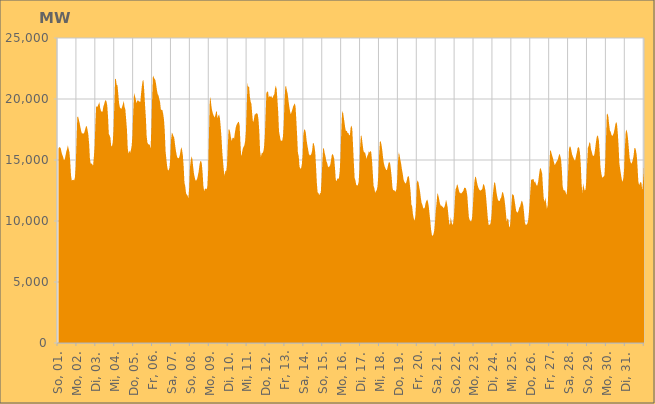
| Category | Series 0 |
|---|---|
|  So, 01.  | 15927.079 |
|  So, 01.  | 16045.231 |
|  So, 01.  | 16044.692 |
|  So, 01.  | 15960.299 |
|  So, 01.  | 15633.229 |
|  So, 01.  | 15411.511 |
|  So, 01.  | 15255.635 |
|  So, 01.  | 14985.755 |
|  So, 01.  | 15044.185 |
|  So, 01.  | 15341.107 |
|  So, 01.  | 15684.877 |
|  So, 01.  | 15892.365 |
|  So, 01.  | 16195.429 |
|  So, 01.  | 15925.532 |
|  So, 01.  | 15640.714 |
|  So, 01.  | 14873.63 |
|  So, 01.  | 13736.748 |
|  Mo, 02.  | 13320.268 |
|  Mo, 02.  | 13361.444 |
|  Mo, 02.  | 13382.235 |
|  Mo, 02.  | 13328.384 |
|  Mo, 02.  | 13590.178 |
|  Mo, 02.  | 14525.185 |
|  Mo, 02.  | 16493.735 |
|  Mo, 02.  | 18518.596 |
|  Mo, 02.  | 18562.772 |
|  Mo, 02.  | 18288.833 |
|  Mo, 02.  | 18009.511 |
|  Mo, 02.  | 17660.415 |
|  Mo, 02.  | 17361.386 |
|  Mo, 02.  | 17139.811 |
|  Mo, 02.  | 17215.992 |
|  Mo, 02.  | 17144.628 |
|  Mo, 02.  | 17276.929 |
|  Mo, 02.  | 17525.181 |
|  Mo, 02.  | 17746.54 |
|  Mo, 02.  | 17790.012 |
|  Mo, 02.  | 17465.107 |
|  Mo, 02.  | 17090.786 |
|  Mo, 02.  | 16329.262 |
|  Mo, 02.  | 15103.662 |
|  Di, 03.  | 14705.078 |
|  Di, 03.  | 14710.866 |
|  Di, 03.  | 14654.954 |
|  Di, 03.  | 14518.518 |
|  Di, 03.  | 15237.282 |
|  Di, 03.  | 16148.23 |
|  Di, 03.  | 18072.305 |
|  Di, 03.  | 19464.539 |
|  Di, 03.  | 19328.822 |
|  Di, 03.  | 19430.29 |
|  Di, 03.  | 19588.605 |
|  Di, 03.  | 19746.651 |
|  Di, 03.  | 19272.316 |
|  Di, 03.  | 19041.483 |
|  Di, 03.  | 18945.129 |
|  Di, 03.  | 18947.379 |
|  Di, 03.  | 19375.949 |
|  Di, 03.  | 19559.212 |
|  Di, 03.  | 19800.662 |
|  Di, 03.  | 19921.464 |
|  Di, 03.  | 19806.998 |
|  Di, 03.  | 19481.165 |
|  Di, 03.  | 18546.411 |
|  Di, 03.  | 17138.491 |
|  Mi, 04.  | 17009.306 |
|  Mi, 04.  | 16825.224 |
|  Mi, 04.  | 16152.452 |
|  Mi, 04.  | 16115.356 |
|  Mi, 04.  | 16464.684 |
|  Mi, 04.  | 17499.272 |
|  Mi, 04.  | 19564.759 |
|  Mi, 04.  | 21662.006 |
|  Mi, 04.  | 21613.36 |
|  Mi, 04.  | 21148.048 |
|  Mi, 04.  | 21130.086 |
|  Mi, 04.  | 20429.32 |
|  Mi, 04.  | 19655.613 |
|  Mi, 04.  | 19316.813 |
|  Mi, 04.  | 19236.579 |
|  Mi, 04.  | 19191.461 |
|  Mi, 04.  | 19379.904 |
|  Mi, 04.  | 19611.864 |
|  Mi, 04.  | 19843.908 |
|  Mi, 04.  | 19350.344 |
|  Mi, 04.  | 19131.708 |
|  Mi, 04.  | 18327.821 |
|  Mi, 04.  | 17504.851 |
|  Mi, 04.  | 15955.735 |
|  Do, 05.  | 15503.848 |
|  Do, 05.  | 15782.482 |
|  Do, 05.  | 15594.392 |
|  Do, 05.  | 15811.9 |
|  Do, 05.  | 16159.142 |
|  Do, 05.  | 17038.131 |
|  Do, 05.  | 18957.955 |
|  Do, 05.  | 20500.95 |
|  Do, 05.  | 20279.702 |
|  Do, 05.  | 20040.693 |
|  Do, 05.  | 19672.086 |
|  Do, 05.  | 19828.694 |
|  Do, 05.  | 19908.26 |
|  Do, 05.  | 19811.851 |
|  Do, 05.  | 19789.364 |
|  Do, 05.  | 19765.614 |
|  Do, 05.  | 20496.89 |
|  Do, 05.  | 21090.006 |
|  Do, 05.  | 21524.597 |
|  Do, 05.  | 21528.552 |
|  Do, 05.  | 20649.972 |
|  Do, 05.  | 19484.883 |
|  Do, 05.  | 18500.813 |
|  Do, 05.  | 16977.879 |
|  Fr, 06.  | 16422.818 |
|  Fr, 06.  | 16301.755 |
|  Fr, 06.  | 16264.225 |
|  Fr, 06.  | 16255.957 |
|  Fr, 06.  | 15922.819 |
|  Fr, 06.  | 17589.227 |
|  Fr, 06.  | 20067.82 |
|  Fr, 06.  | 21935.267 |
|  Fr, 06.  | 21796.289 |
|  Fr, 06.  | 21649.845 |
|  Fr, 06.  | 21564.097 |
|  Fr, 06.  | 21211.149 |
|  Fr, 06.  | 20744.559 |
|  Fr, 06.  | 20402.213 |
|  Fr, 06.  | 20303.792 |
|  Fr, 06.  | 20003.82 |
|  Fr, 06.  | 19773.152 |
|  Fr, 06.  | 19174.81 |
|  Fr, 06.  | 19093.821 |
|  Fr, 06.  | 19089.906 |
|  Fr, 06.  | 18779.025 |
|  Fr, 06.  | 18329.415 |
|  Fr, 06.  | 17394.875 |
|  Fr, 06.  | 15750.207 |
|  Sa, 07.  | 15083.527 |
|  Sa, 07.  | 14500.605 |
|  Sa, 07.  | 14156.062 |
|  Sa, 07.  | 14163.633 |
|  Sa, 07.  | 14374.859 |
|  Sa, 07.  | 15182.906 |
|  Sa, 07.  | 16668.899 |
|  Sa, 07.  | 17231.1 |
|  Sa, 07.  | 17156.516 |
|  Sa, 07.  | 16959.769 |
|  Sa, 07.  | 16824.289 |
|  Sa, 07.  | 16295.746 |
|  Sa, 07.  | 15822.733 |
|  Sa, 07.  | 15452.035 |
|  Sa, 07.  | 15198.79 |
|  Sa, 07.  | 15139.945 |
|  Sa, 07.  | 15162.875 |
|  Sa, 07.  | 15366.094 |
|  Sa, 07.  | 15754.077 |
|  Sa, 07.  | 16065.162 |
|  Sa, 07.  | 15806.772 |
|  Sa, 07.  | 15356.386 |
|  Sa, 07.  | 14466.235 |
|  Sa, 07.  | 13125.078 |
|  So, 08.  | 12874.201 |
|  So, 08.  | 12274.222 |
|  So, 08.  | 12161.416 |
|  So, 08.  | 12066.334 |
|  So, 08.  | 11878.799 |
|  So, 08.  | 12745.21 |
|  So, 08.  | 14416.777 |
|  So, 08.  | 14947.523 |
|  So, 08.  | 15297.003 |
|  So, 08.  | 15099.836 |
|  So, 08.  | 14476.612 |
|  So, 08.  | 13907.553 |
|  So, 08.  | 13586.481 |
|  So, 08.  | 13330.982 |
|  So, 08.  | 13319.822 |
|  So, 08.  | 13441.007 |
|  So, 08.  | 13713.567 |
|  So, 08.  | 14045.736 |
|  So, 08.  | 14562.791 |
|  So, 08.  | 14884.782 |
|  So, 08.  | 14927.401 |
|  So, 08.  | 14712.946 |
|  So, 08.  | 13975.582 |
|  So, 08.  | 12893.07 |
|  Mo, 09.  | 12432.326 |
|  Mo, 09.  | 12643.992 |
|  Mo, 09.  | 12655.448 |
|  Mo, 09.  | 12596.035 |
|  Mo, 09.  | 12788.009 |
|  Mo, 09.  | 13998.253 |
|  Mo, 09.  | 16774.513 |
|  Mo, 09.  | 19798.482 |
|  Mo, 09.  | 20189.862 |
|  Mo, 09.  | 19523.563 |
|  Mo, 09.  | 19078.41 |
|  Mo, 09.  | 18818.896 |
|  Mo, 09.  | 18655.475 |
|  Mo, 09.  | 18485.923 |
|  Mo, 09.  | 18617.385 |
|  Mo, 09.  | 18898.708 |
|  Mo, 09.  | 19039.889 |
|  Mo, 09.  | 18419.894 |
|  Mo, 09.  | 18639.972 |
|  Mo, 09.  | 18719.612 |
|  Mo, 09.  | 18433.921 |
|  Mo, 09.  | 17714.583 |
|  Mo, 09.  | 16845.671 |
|  Mo, 09.  | 15678.482 |
|  Di, 10.  | 14854.463 |
|  Di, 10.  | 14126.716 |
|  Di, 10.  | 13716.311 |
|  Di, 10.  | 14128.229 |
|  Di, 10.  | 14078.07 |
|  Di, 10.  | 14574.613 |
|  Di, 10.  | 16121.51 |
|  Di, 10.  | 17510.105 |
|  Di, 10.  | 17506.627 |
|  Di, 10.  | 17268.37 |
|  Di, 10.  | 16836.304 |
|  Di, 10.  | 16562.702 |
|  Di, 10.  | 16802.192 |
|  Di, 10.  | 16834.482 |
|  Di, 10.  | 16753.481 |
|  Di, 10.  | 17247.6 |
|  Di, 10.  | 17635.096 |
|  Di, 10.  | 17872.885 |
|  Di, 10.  | 17982.721 |
|  Di, 10.  | 18105.398 |
|  Di, 10.  | 18139.429 |
|  Di, 10.  | 17853.802 |
|  Di, 10.  | 16448.515 |
|  Di, 10.  | 15292.809 |
|  Mi, 11.  | 15578.023 |
|  Mi, 11.  | 15933.237 |
|  Mi, 11.  | 16070.48 |
|  Mi, 11.  | 16202.308 |
|  Mi, 11.  | 16530.771 |
|  Mi, 11.  | 17359.334 |
|  Mi, 11.  | 19274.159 |
|  Mi, 11.  | 21363.168 |
|  Mi, 11.  | 20988.623 |
|  Mi, 11.  | 21011.95 |
|  Mi, 11.  | 20202.534 |
|  Mi, 11.  | 19781.148 |
|  Mi, 11.  | 19590.381 |
|  Mi, 11.  | 18757.637 |
|  Mi, 11.  | 18075.677 |
|  Mi, 11.  | 18273.199 |
|  Mi, 11.  | 18709.298 |
|  Mi, 11.  | 18740.454 |
|  Mi, 11.  | 18835.824 |
|  Mi, 11.  | 18817.457 |
|  Mi, 11.  | 18756.23 |
|  Mi, 11.  | 18282.949 |
|  Mi, 11.  | 17309.56 |
|  Mi, 11.  | 15702.284 |
|  Do, 12.  | 15254.237 |
|  Do, 12.  | 15548.951 |
|  Do, 12.  | 15572.027 |
|  Do, 12.  | 15670.345 |
|  Do, 12.  | 16036.696 |
|  Do, 12.  | 16956.189 |
|  Do, 12.  | 18692.157 |
|  Do, 12.  | 20508.153 |
|  Do, 12.  | 20580.723 |
|  Do, 12.  | 20647.324 |
|  Do, 12.  | 20092.184 |
|  Do, 12.  | 20268.342 |
|  Do, 12.  | 20166.165 |
|  Do, 12.  | 20273.484 |
|  Do, 12.  | 20111.078 |
|  Do, 12.  | 20090.433 |
|  Do, 12.  | 20303.885 |
|  Do, 12.  | 20373.339 |
|  Do, 12.  | 20883.599 |
|  Do, 12.  | 21100.683 |
|  Do, 12.  | 20811.795 |
|  Do, 12.  | 19936.78 |
|  Do, 12.  | 18910.438 |
|  Do, 12.  | 17338.736 |
|  Fr, 13.  | 17002.839 |
|  Fr, 13.  | 16618.084 |
|  Fr, 13.  | 16576.585 |
|  Fr, 13.  | 16572.6 |
|  Fr, 13.  | 16915.72 |
|  Fr, 13.  | 17906.504 |
|  Fr, 13.  | 19888.688 |
|  Fr, 13.  | 21011.743 |
|  Fr, 13.  | 21049.659 |
|  Fr, 13.  | 20700.345 |
|  Fr, 13.  | 20431.747 |
|  Fr, 13.  | 19884.737 |
|  Fr, 13.  | 19387.684 |
|  Fr, 13.  | 18987.471 |
|  Fr, 13.  | 18747.448 |
|  Fr, 13.  | 18944.583 |
|  Fr, 13.  | 19160.311 |
|  Fr, 13.  | 19405.579 |
|  Fr, 13.  | 19531.265 |
|  Fr, 13.  | 19650.975 |
|  Fr, 13.  | 19377.835 |
|  Fr, 13.  | 18245.232 |
|  Fr, 13.  | 17009.302 |
|  Fr, 13.  | 15572.942 |
|  Sa, 14.  | 15327.669 |
|  Sa, 14.  | 14449.413 |
|  Sa, 14.  | 14299.104 |
|  Sa, 14.  | 14313.208 |
|  Sa, 14.  | 14658.816 |
|  Sa, 14.  | 15430.369 |
|  Sa, 14.  | 17153.365 |
|  Sa, 14.  | 17495.157 |
|  Sa, 14.  | 17493.55 |
|  Sa, 14.  | 17232.696 |
|  Sa, 14.  | 16625.506 |
|  Sa, 14.  | 16210.49 |
|  Sa, 14.  | 15839.962 |
|  Sa, 14.  | 15486.665 |
|  Sa, 14.  | 15381.416 |
|  Sa, 14.  | 15396.918 |
|  Sa, 14.  | 15482.015 |
|  Sa, 14.  | 15765.803 |
|  Sa, 14.  | 16359.188 |
|  Sa, 14.  | 16391.394 |
|  Sa, 14.  | 16123.49 |
|  Sa, 14.  | 15621.714 |
|  Sa, 14.  | 14467.005 |
|  Sa, 14.  | 13143.41 |
|  So, 15.  | 12348.289 |
|  So, 15.  | 12298.63 |
|  So, 15.  | 12114.301 |
|  So, 15.  | 12272.508 |
|  So, 15.  | 12306.97 |
|  So, 15.  | 13389.435 |
|  So, 15.  | 14811.005 |
|  So, 15.  | 15979.529 |
|  So, 15.  | 15926.096 |
|  So, 15.  | 15565.336 |
|  So, 15.  | 15307.496 |
|  So, 15.  | 14911.631 |
|  So, 15.  | 14783.445 |
|  So, 15.  | 14485.78 |
|  So, 15.  | 14408.47 |
|  So, 15.  | 14475.59 |
|  So, 15.  | 14592.968 |
|  So, 15.  | 14971.526 |
|  So, 15.  | 15407.571 |
|  So, 15.  | 15502.772 |
|  So, 15.  | 15364.167 |
|  So, 15.  | 15125.543 |
|  So, 15.  | 14384.77 |
|  So, 15.  | 13413.98 |
|  Mo, 16.  | 13244.274 |
|  Mo, 16.  | 13469.966 |
|  Mo, 16.  | 13478.51 |
|  Mo, 16.  | 13482.099 |
|  Mo, 16.  | 14047.562 |
|  Mo, 16.  | 15252.799 |
|  Mo, 16.  | 17264.774 |
|  Mo, 16.  | 18807.659 |
|  Mo, 16.  | 19011.036 |
|  Mo, 16.  | 18579.296 |
|  Mo, 16.  | 18128.981 |
|  Mo, 16.  | 17642.514 |
|  Mo, 16.  | 17363.183 |
|  Mo, 16.  | 17401.954 |
|  Mo, 16.  | 17217.725 |
|  Mo, 16.  | 17221.265 |
|  Mo, 16.  | 17018.751 |
|  Mo, 16.  | 17070.315 |
|  Mo, 16.  | 17690.805 |
|  Mo, 16.  | 17820.426 |
|  Mo, 16.  | 17533.63 |
|  Mo, 16.  | 16141.086 |
|  Mo, 16.  | 14732.728 |
|  Mo, 16.  | 13506.202 |
|  Di, 17.  | 13332.439 |
|  Di, 17.  | 12956.024 |
|  Di, 17.  | 12914.626 |
|  Di, 17.  | 12924.072 |
|  Di, 17.  | 13171.636 |
|  Di, 17.  | 14148.79 |
|  Di, 17.  | 16179.603 |
|  Di, 17.  | 17057.157 |
|  Di, 17.  | 16906.02 |
|  Di, 17.  | 16348.762 |
|  Di, 17.  | 15830.299 |
|  Di, 17.  | 15591.706 |
|  Di, 17.  | 15664.95 |
|  Di, 17.  | 15404.809 |
|  Di, 17.  | 15078.407 |
|  Di, 17.  | 15323.951 |
|  Di, 17.  | 15446.05 |
|  Di, 17.  | 15722.52 |
|  Di, 17.  | 15603.361 |
|  Di, 17.  | 15736.043 |
|  Di, 17.  | 15658.081 |
|  Di, 17.  | 14998.503 |
|  Di, 17.  | 13976.18 |
|  Di, 17.  | 12878.038 |
|  Mi, 18.  | 12698.397 |
|  Mi, 18.  | 12307.197 |
|  Mi, 18.  | 12441.141 |
|  Mi, 18.  | 12530.561 |
|  Mi, 18.  | 12823.163 |
|  Mi, 18.  | 13706.127 |
|  Mi, 18.  | 15380.988 |
|  Mi, 18.  | 16478.847 |
|  Mi, 18.  | 16556.412 |
|  Mi, 18.  | 16268.149 |
|  Mi, 18.  | 15824.55 |
|  Mi, 18.  | 15232.278 |
|  Mi, 18.  | 14753.152 |
|  Mi, 18.  | 14492.273 |
|  Mi, 18.  | 14331.193 |
|  Mi, 18.  | 14191.59 |
|  Mi, 18.  | 14176.721 |
|  Mi, 18.  | 14453.327 |
|  Mi, 18.  | 14761.974 |
|  Mi, 18.  | 14843.549 |
|  Mi, 18.  | 14710.061 |
|  Mi, 18.  | 14215.548 |
|  Mi, 18.  | 13571.37 |
|  Mi, 18.  | 12719.835 |
|  Do, 19.  | 12504.61 |
|  Do, 19.  | 12543.476 |
|  Do, 19.  | 12454.465 |
|  Do, 19.  | 12403.556 |
|  Do, 19.  | 12621.602 |
|  Do, 19.  | 13426.773 |
|  Do, 19.  | 14823.107 |
|  Do, 19.  | 15652.65 |
|  Do, 19.  | 15401.736 |
|  Do, 19.  | 15012.413 |
|  Do, 19.  | 14691.812 |
|  Do, 19.  | 14240.413 |
|  Do, 19.  | 13881.657 |
|  Do, 19.  | 13421.468 |
|  Do, 19.  | 13224.777 |
|  Do, 19.  | 13125.06 |
|  Do, 19.  | 13069.751 |
|  Do, 19.  | 13278.524 |
|  Do, 19.  | 13583.421 |
|  Do, 19.  | 13703.449 |
|  Do, 19.  | 13582.101 |
|  Do, 19.  | 13023.521 |
|  Do, 19.  | 12406.129 |
|  Do, 19.  | 11358.982 |
|  Fr, 20.  | 11181.24 |
|  Fr, 20.  | 10528.939 |
|  Fr, 20.  | 10223.012 |
|  Fr, 20.  | 10015.382 |
|  Fr, 20.  | 10385.136 |
|  Fr, 20.  | 11382.461 |
|  Fr, 20.  | 13159.327 |
|  Fr, 20.  | 13332.088 |
|  Fr, 20.  | 13179.138 |
|  Fr, 20.  | 12770.693 |
|  Fr, 20.  | 12414.529 |
|  Fr, 20.  | 11877.102 |
|  Fr, 20.  | 11482.435 |
|  Fr, 20.  | 11315.351 |
|  Fr, 20.  | 11065.921 |
|  Fr, 20.  | 11013.246 |
|  Fr, 20.  | 11099.418 |
|  Fr, 20.  | 11469.385 |
|  Fr, 20.  | 11644.78 |
|  Fr, 20.  | 11764.288 |
|  Fr, 20.  | 11588.376 |
|  Fr, 20.  | 11226.743 |
|  Fr, 20.  | 10602.973 |
|  Fr, 20.  | 9998.304 |
|  Sa, 21.  | 9291.531 |
|  Sa, 21.  | 8874.412 |
|  Sa, 21.  | 8767.247 |
|  Sa, 21.  | 8920.935 |
|  Sa, 21.  | 9216.418 |
|  Sa, 21.  | 9916.653 |
|  Sa, 21.  | 10867.909 |
|  Sa, 21.  | 11520.685 |
|  Sa, 21.  | 12274.893 |
|  Sa, 21.  | 12147.937 |
|  Sa, 21.  | 11868.541 |
|  Sa, 21.  | 11497.997 |
|  Sa, 21.  | 11280.782 |
|  Sa, 21.  | 11276.097 |
|  Sa, 21.  | 11178.729 |
|  Sa, 21.  | 11174.792 |
|  Sa, 21.  | 11025.285 |
|  Sa, 21.  | 11162.009 |
|  Sa, 21.  | 11388.587 |
|  Sa, 21.  | 11747.692 |
|  Sa, 21.  | 11479.635 |
|  Sa, 21.  | 11128.453 |
|  Sa, 21.  | 10474.501 |
|  Sa, 21.  | 9821.173 |
|  So, 22.  | 9665.65 |
|  So, 22.  | 10340.68 |
|  So, 22.  | 9906.672 |
|  So, 22.  | 9676.827 |
|  So, 22.  | 9814.056 |
|  So, 22.  | 10390.355 |
|  So, 22.  | 11483.323 |
|  So, 22.  | 12590.514 |
|  So, 22.  | 12735.221 |
|  So, 22.  | 13017.859 |
|  So, 22.  | 12891.82 |
|  So, 22.  | 12584.626 |
|  So, 22.  | 12340.467 |
|  So, 22.  | 12302.321 |
|  So, 22.  | 12245.374 |
|  So, 22.  | 12308.687 |
|  So, 22.  | 12391.752 |
|  So, 22.  | 12488.102 |
|  So, 22.  | 12707.698 |
|  So, 22.  | 12737.816 |
|  So, 22.  | 12693.208 |
|  So, 22.  | 12487.092 |
|  So, 22.  | 12065.783 |
|  So, 22.  | 11131.332 |
|  Mo, 23.  | 10312.325 |
|  Mo, 23.  | 10075.223 |
|  Mo, 23.  | 9988.033 |
|  Mo, 23.  | 9979.4 |
|  Mo, 23.  | 10250.103 |
|  Mo, 23.  | 11103.896 |
|  Mo, 23.  | 12316.751 |
|  Mo, 23.  | 13210.501 |
|  Mo, 23.  | 13655.431 |
|  Mo, 23.  | 13582.928 |
|  Mo, 23.  | 13247.75 |
|  Mo, 23.  | 12947.458 |
|  Mo, 23.  | 12723.667 |
|  Mo, 23.  | 12597.001 |
|  Mo, 23.  | 12510.176 |
|  Mo, 23.  | 12500.944 |
|  Mo, 23.  | 12558.596 |
|  Mo, 23.  | 12637.332 |
|  Mo, 23.  | 12964.387 |
|  Mo, 23.  | 13026.795 |
|  Mo, 23.  | 12812.732 |
|  Mo, 23.  | 12498.127 |
|  Mo, 23.  | 11830.562 |
|  Mo, 23.  | 11040.926 |
|  Di, 24.  | 10230.375 |
|  Di, 24.  | 9685.163 |
|  Di, 24.  | 9696.141 |
|  Di, 24.  | 9731.289 |
|  Di, 24.  | 9995.132 |
|  Di, 24.  | 10709.336 |
|  Di, 24.  | 11871.676 |
|  Di, 24.  | 12548.887 |
|  Di, 24.  | 13085.336 |
|  Di, 24.  | 13207.652 |
|  Di, 24.  | 12864.437 |
|  Di, 24.  | 12354.108 |
|  Di, 24.  | 11990.346 |
|  Di, 24.  | 11694.618 |
|  Di, 24.  | 11653.907 |
|  Di, 24.  | 11633.308 |
|  Di, 24.  | 11827.894 |
|  Di, 24.  | 11930.39 |
|  Di, 24.  | 12283.453 |
|  Di, 24.  | 12410.784 |
|  Di, 24.  | 12179.76 |
|  Di, 24.  | 11855.282 |
|  Di, 24.  | 11325.309 |
|  Di, 24.  | 10640.773 |
|  Mi, 25.  | 9909.5 |
|  Mi, 25.  | 10212.565 |
|  Mi, 25.  | 10138.421 |
|  Mi, 25.  | 9593.175 |
|  Mi, 25.  | 9478.167 |
|  Mi, 25.  | 10168.294 |
|  Mi, 25.  | 11380.443 |
|  Mi, 25.  | 12223.409 |
|  Mi, 25.  | 12156.443 |
|  Mi, 25.  | 12104.898 |
|  Mi, 25.  | 11679.071 |
|  Mi, 25.  | 11237.059 |
|  Mi, 25.  | 10826.507 |
|  Mi, 25.  | 10724.075 |
|  Mi, 25.  | 10687.969 |
|  Mi, 25.  | 10856.29 |
|  Mi, 25.  | 11108.824 |
|  Mi, 25.  | 11193.099 |
|  Mi, 25.  | 11462.983 |
|  Mi, 25.  | 11674.3 |
|  Mi, 25.  | 11563.176 |
|  Mi, 25.  | 11288.165 |
|  Mi, 25.  | 10693.055 |
|  Mi, 25.  | 9907.535 |
|  Do, 26.  | 9684.667 |
|  Do, 26.  | 9689.2 |
|  Do, 26.  | 9768.265 |
|  Do, 26.  | 9951.38 |
|  Do, 26.  | 10570.566 |
|  Do, 26.  | 11378.014 |
|  Do, 26.  | 12469.23 |
|  Do, 26.  | 13378.759 |
|  Do, 26.  | 13409.231 |
|  Do, 26.  | 13418.559 |
|  Do, 26.  | 13458.824 |
|  Do, 26.  | 13142.167 |
|  Do, 26.  | 13260.59 |
|  Do, 26.  | 13060.853 |
|  Do, 26.  | 12893.635 |
|  Do, 26.  | 12936.649 |
|  Do, 26.  | 13247.637 |
|  Do, 26.  | 13767.203 |
|  Do, 26.  | 14221.876 |
|  Do, 26.  | 14353.997 |
|  Do, 26.  | 14135.53 |
|  Do, 26.  | 13867.68 |
|  Do, 26.  | 12768.706 |
|  Do, 26.  | 11841.408 |
|  Fr, 27.  | 11559.135 |
|  Fr, 27.  | 11927.426 |
|  Fr, 27.  | 11479.044 |
|  Fr, 27.  | 11018.18 |
|  Fr, 27.  | 11286.447 |
|  Fr, 27.  | 12581.671 |
|  Fr, 27.  | 14248.298 |
|  Fr, 27.  | 15761.474 |
|  Fr, 27.  | 15779.009 |
|  Fr, 27.  | 15505.024 |
|  Fr, 27.  | 15298.401 |
|  Fr, 27.  | 15071.06 |
|  Fr, 27.  | 14799.802 |
|  Fr, 27.  | 14571.819 |
|  Fr, 27.  | 14709.329 |
|  Fr, 27.  | 14830.839 |
|  Fr, 27.  | 14936.444 |
|  Fr, 27.  | 15067.39 |
|  Fr, 27.  | 15337.254 |
|  Fr, 27.  | 15516.64 |
|  Fr, 27.  | 15327.854 |
|  Fr, 27.  | 15013.292 |
|  Fr, 27.  | 14152.803 |
|  Fr, 27.  | 12845.851 |
|  Sa, 28.  | 12563.03 |
|  Sa, 28.  | 12494.291 |
|  Sa, 28.  | 12523.743 |
|  Sa, 28.  | 12297.056 |
|  Sa, 28.  | 12153.675 |
|  Sa, 28.  | 12835.451 |
|  Sa, 28.  | 14227.074 |
|  Sa, 28.  | 15899.467 |
|  Sa, 28.  | 16123.507 |
|  Sa, 28.  | 16079.506 |
|  Sa, 28.  | 15787.681 |
|  Sa, 28.  | 15462.121 |
|  Sa, 28.  | 15282.762 |
|  Sa, 28.  | 15130.076 |
|  Sa, 28.  | 14985.693 |
|  Sa, 28.  | 14983.64 |
|  Sa, 28.  | 15333.554 |
|  Sa, 28.  | 15607.027 |
|  Sa, 28.  | 15985.688 |
|  Sa, 28.  | 16072.524 |
|  Sa, 28.  | 15963.816 |
|  Sa, 28.  | 15582.591 |
|  Sa, 28.  | 14609.476 |
|  Sa, 28.  | 13059.91 |
|  So, 29.  | 12298.431 |
|  So, 29.  | 13068.439 |
|  So, 29.  | 12738.29 |
|  So, 29.  | 12497.929 |
|  So, 29.  | 12578.166 |
|  So, 29.  | 13271.631 |
|  So, 29.  | 14663.25 |
|  So, 29.  | 16003.585 |
|  So, 29.  | 16158.202 |
|  So, 29.  | 16471.671 |
|  So, 29.  | 16372.818 |
|  So, 29.  | 15868.573 |
|  So, 29.  | 15662.249 |
|  So, 29.  | 15395.221 |
|  So, 29.  | 15333.136 |
|  So, 29.  | 15383.194 |
|  So, 29.  | 15794.716 |
|  So, 29.  | 16332.042 |
|  So, 29.  | 16803.452 |
|  So, 29.  | 17029.25 |
|  So, 29.  | 16919.57 |
|  So, 29.  | 16582.136 |
|  So, 29.  | 15593.964 |
|  So, 29.  | 14402.598 |
|  Mo, 30.  | 13925.676 |
|  Mo, 30.  | 13597.067 |
|  Mo, 30.  | 13567.332 |
|  Mo, 30.  | 13647.829 |
|  Mo, 30.  | 13729.828 |
|  Mo, 30.  | 14777.937 |
|  Mo, 30.  | 16705.43 |
|  Mo, 30.  | 18716.902 |
|  Mo, 30.  | 18815.317 |
|  Mo, 30.  | 18537.547 |
|  Mo, 30.  | 17905.498 |
|  Mo, 30.  | 17396.414 |
|  Mo, 30.  | 17308.967 |
|  Mo, 30.  | 17054.341 |
|  Mo, 30.  | 16962.987 |
|  Mo, 30.  | 17078.394 |
|  Mo, 30.  | 17245.011 |
|  Mo, 30.  | 17583.128 |
|  Mo, 30.  | 17962.487 |
|  Mo, 30.  | 18122.772 |
|  Mo, 30.  | 17930.28 |
|  Mo, 30.  | 17185.324 |
|  Mo, 30.  | 16097.593 |
|  Mo, 30.  | 14703.741 |
|  Di, 31.  | 14253.565 |
|  Di, 31.  | 13818.747 |
|  Di, 31.  | 13413.213 |
|  Di, 31.  | 13207.313 |
|  Di, 31.  | 13494.324 |
|  Di, 31.  | 14251.462 |
|  Di, 31.  | 16017.97 |
|  Di, 31.  | 17279.551 |
|  Di, 31.  | 17499.124 |
|  Di, 31.  | 17233.851 |
|  Di, 31.  | 16718.034 |
|  Di, 31.  | 15924.179 |
|  Di, 31.  | 15172.277 |
|  Di, 31.  | 14856.621 |
|  Di, 31.  | 14704.736 |
|  Di, 31.  | 14788.718 |
|  Di, 31.  | 15019.309 |
|  Di, 31.  | 15347.769 |
|  Di, 31.  | 15957.07 |
|  Di, 31.  | 15989.214 |
|  Di, 31.  | 15801.532 |
|  Di, 31.  | 15398.808 |
|  Di, 31.  | 14476.399 |
|  Di, 31.  | 13271.746 |
|  Mi, 01.  | 12938.96 |
|  Mi, 01.  | 13102.228 |
|  Mi, 01.  | 13206.982 |
|  Mi, 01.  | 13124.455 |
|  Mi, 01.  | 12517.004 |
|  Mi, 01.  | 13150.603 |
|    | 14738.622 |